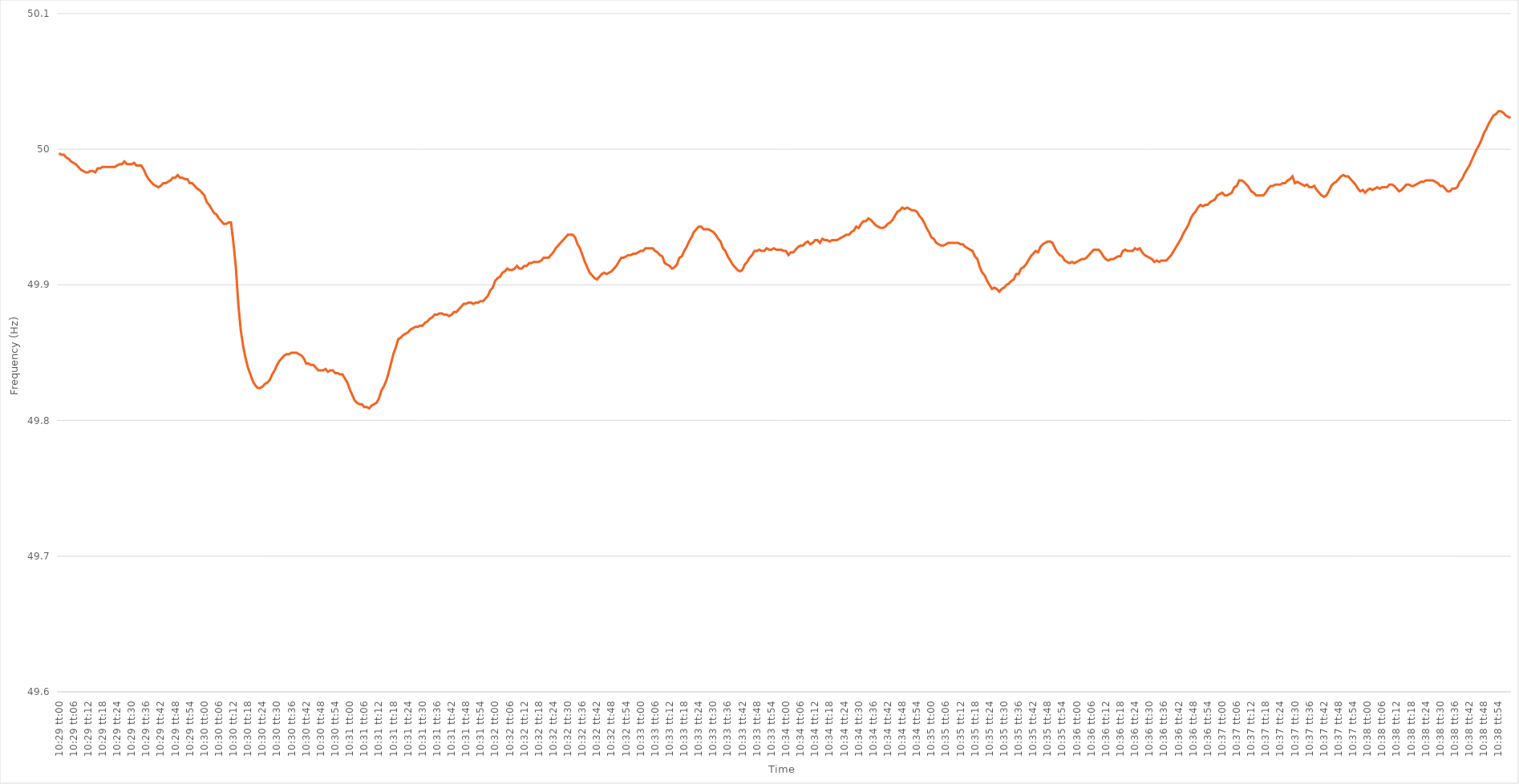
| Category | Series 0 |
|---|---|
| 0.4368055555555555 | 49.997 |
| 0.43681712962962965 | 49.996 |
| 0.4368287037037037 | 49.996 |
| 0.4368402777777778 | 49.994 |
| 0.4368518518518518 | 49.993 |
| 0.4368634259259259 | 49.991 |
| 0.43687499999999996 | 49.99 |
| 0.4368865740740741 | 49.989 |
| 0.43689814814814815 | 49.987 |
| 0.43690972222222224 | 49.985 |
| 0.4369212962962963 | 49.984 |
| 0.4369328703703704 | 49.983 |
| 0.4369444444444444 | 49.983 |
| 0.43695601851851856 | 49.984 |
| 0.4369675925925926 | 49.984 |
| 0.4369791666666667 | 49.983 |
| 0.43699074074074074 | 49.986 |
| 0.43700231481481483 | 49.986 |
| 0.43701388888888887 | 49.987 |
| 0.437025462962963 | 49.987 |
| 0.43703703703703706 | 49.987 |
| 0.4370486111111111 | 49.987 |
| 0.4370601851851852 | 49.987 |
| 0.43707175925925923 | 49.987 |
| 0.4370833333333333 | 49.988 |
| 0.43709490740740736 | 49.989 |
| 0.4371064814814815 | 49.989 |
| 0.43711805555555555 | 49.991 |
| 0.43712962962962965 | 49.989 |
| 0.4371412037037037 | 49.989 |
| 0.4371527777777778 | 49.989 |
| 0.4371643518518518 | 49.99 |
| 0.43717592592592597 | 49.988 |
| 0.4371875 | 49.988 |
| 0.4371990740740741 | 49.988 |
| 0.43721064814814814 | 49.985 |
| 0.43722222222222223 | 49.981 |
| 0.4372337962962963 | 49.978 |
| 0.4372453703703704 | 49.976 |
| 0.43725694444444446 | 49.974 |
| 0.4372685185185185 | 49.973 |
| 0.4372800925925926 | 49.972 |
| 0.43729166666666663 | 49.973 |
| 0.43730324074074073 | 49.975 |
| 0.43731481481481477 | 49.975 |
| 0.4373263888888889 | 49.976 |
| 0.43733796296296296 | 49.977 |
| 0.43734953703703705 | 49.979 |
| 0.4373611111111111 | 49.979 |
| 0.4373726851851852 | 49.981 |
| 0.4373842592592592 | 49.979 |
| 0.4373958333333334 | 49.979 |
| 0.4374074074074074 | 49.978 |
| 0.4374189814814815 | 49.978 |
| 0.43743055555555554 | 49.975 |
| 0.43744212962962964 | 49.975 |
| 0.4374537037037037 | 49.973 |
| 0.43746527777777783 | 49.971 |
| 0.43747685185185187 | 49.97 |
| 0.43748842592592596 | 49.968 |
| 0.4375 | 49.966 |
| 0.43751157407407404 | 49.961 |
| 0.43752314814814813 | 49.959 |
| 0.43753472222222217 | 49.956 |
| 0.4375462962962963 | 49.953 |
| 0.43755787037037036 | 49.952 |
| 0.43756944444444446 | 49.949 |
| 0.4375810185185185 | 49.947 |
| 0.4375925925925926 | 49.945 |
| 0.4376041666666666 | 49.945 |
| 0.4376157407407408 | 49.946 |
| 0.4376273148148148 | 49.946 |
| 0.4376388888888889 | 49.931 |
| 0.43765046296296295 | 49.913 |
| 0.43766203703703704 | 49.886 |
| 0.4376736111111111 | 49.867 |
| 0.43768518518518523 | 49.855 |
| 0.43769675925925927 | 49.846 |
| 0.43770833333333337 | 49.839 |
| 0.4377199074074074 | 49.834 |
| 0.4377314814814815 | 49.829 |
| 0.43774305555555554 | 49.826 |
| 0.4377546296296296 | 49.824 |
| 0.4377662037037037 | 49.824 |
| 0.43777777777777777 | 49.825 |
| 0.43778935185185186 | 49.827 |
| 0.4378009259259259 | 49.828 |
| 0.4378125 | 49.83 |
| 0.43782407407407403 | 49.834 |
| 0.4378356481481482 | 49.837 |
| 0.4378472222222222 | 49.841 |
| 0.4378587962962963 | 49.844 |
| 0.43787037037037035 | 49.846 |
| 0.43788194444444445 | 49.848 |
| 0.4378935185185185 | 49.849 |
| 0.43790509259259264 | 49.849 |
| 0.4379166666666667 | 49.85 |
| 0.43792824074074077 | 49.85 |
| 0.4379398148148148 | 49.85 |
| 0.4379513888888889 | 49.849 |
| 0.43796296296296294 | 49.848 |
| 0.437974537037037 | 49.846 |
| 0.43798611111111113 | 49.842 |
| 0.43799768518518517 | 49.842 |
| 0.43800925925925926 | 49.841 |
| 0.4380208333333333 | 49.841 |
| 0.4380324074074074 | 49.839 |
| 0.43804398148148144 | 49.837 |
| 0.4380555555555556 | 49.837 |
| 0.4380671296296296 | 49.837 |
| 0.4380787037037037 | 49.838 |
| 0.43809027777777776 | 49.836 |
| 0.43810185185185185 | 49.837 |
| 0.4381134259259259 | 49.837 |
| 0.43812500000000004 | 49.835 |
| 0.4381365740740741 | 49.835 |
| 0.4381481481481482 | 49.834 |
| 0.4381597222222222 | 49.834 |
| 0.4381712962962963 | 49.831 |
| 0.43818287037037035 | 49.828 |
| 0.4381944444444445 | 49.823 |
| 0.43820601851851854 | 49.819 |
| 0.43821759259259263 | 49.815 |
| 0.43822916666666667 | 49.813 |
| 0.4382407407407407 | 49.812 |
| 0.4382523148148148 | 49.812 |
| 0.43826388888888884 | 49.81 |
| 0.438275462962963 | 49.81 |
| 0.43828703703703703 | 49.809 |
| 0.4382986111111111 | 49.811 |
| 0.43831018518518516 | 49.812 |
| 0.43832175925925926 | 49.813 |
| 0.4383333333333333 | 49.816 |
| 0.43834490740740745 | 49.822 |
| 0.4383564814814815 | 49.825 |
| 0.4383680555555556 | 49.829 |
| 0.4383796296296296 | 49.835 |
| 0.4383912037037037 | 49.842 |
| 0.43840277777777775 | 49.849 |
| 0.4384143518518519 | 49.854 |
| 0.43842592592592594 | 49.86 |
| 0.43843750000000004 | 49.861 |
| 0.4384490740740741 | 49.863 |
| 0.4384606481481481 | 49.864 |
| 0.4384722222222222 | 49.865 |
| 0.43848379629629625 | 49.867 |
| 0.4384953703703704 | 49.868 |
| 0.43850694444444444 | 49.869 |
| 0.43851851851851853 | 49.869 |
| 0.43853009259259257 | 49.87 |
| 0.43854166666666666 | 49.87 |
| 0.4385532407407407 | 49.872 |
| 0.43856481481481485 | 49.873 |
| 0.4385763888888889 | 49.875 |
| 0.438587962962963 | 49.876 |
| 0.438599537037037 | 49.878 |
| 0.4386111111111111 | 49.878 |
| 0.43862268518518516 | 49.879 |
| 0.4386342592592593 | 49.879 |
| 0.43864583333333335 | 49.878 |
| 0.43865740740740744 | 49.878 |
| 0.4386689814814815 | 49.877 |
| 0.4386805555555555 | 49.878 |
| 0.4386921296296296 | 49.88 |
| 0.43870370370370365 | 49.88 |
| 0.4387152777777778 | 49.882 |
| 0.43872685185185184 | 49.884 |
| 0.43873842592592593 | 49.886 |
| 0.43875 | 49.886 |
| 0.43876157407407407 | 49.887 |
| 0.4387731481481481 | 49.887 |
| 0.43878472222222226 | 49.886 |
| 0.4387962962962963 | 49.887 |
| 0.4388078703703704 | 49.887 |
| 0.43881944444444443 | 49.888 |
| 0.4388310185185185 | 49.888 |
| 0.43884259259259256 | 49.89 |
| 0.4388541666666667 | 49.892 |
| 0.43886574074074075 | 49.896 |
| 0.43887731481481485 | 49.898 |
| 0.4388888888888889 | 49.903 |
| 0.438900462962963 | 49.905 |
| 0.438912037037037 | 49.906 |
| 0.43892361111111106 | 49.909 |
| 0.4389351851851852 | 49.91 |
| 0.43894675925925924 | 49.912 |
| 0.43895833333333334 | 49.911 |
| 0.4389699074074074 | 49.911 |
| 0.4389814814814815 | 49.912 |
| 0.4389930555555555 | 49.914 |
| 0.43900462962962966 | 49.912 |
| 0.4390162037037037 | 49.912 |
| 0.4390277777777778 | 49.914 |
| 0.43903935185185183 | 49.914 |
| 0.43905092592592593 | 49.916 |
| 0.43906249999999997 | 49.916 |
| 0.4390740740740741 | 49.917 |
| 0.43908564814814816 | 49.917 |
| 0.43909722222222225 | 49.917 |
| 0.4391087962962963 | 49.918 |
| 0.4391203703703704 | 49.92 |
| 0.4391319444444444 | 49.92 |
| 0.43914351851851857 | 49.92 |
| 0.4391550925925926 | 49.922 |
| 0.43916666666666665 | 49.924 |
| 0.43917824074074074 | 49.927 |
| 0.4391898148148148 | 49.929 |
| 0.4392013888888889 | 49.931 |
| 0.4392129629629629 | 49.933 |
| 0.43922453703703707 | 49.935 |
| 0.4392361111111111 | 49.937 |
| 0.4392476851851852 | 49.937 |
| 0.43925925925925924 | 49.937 |
| 0.43927083333333333 | 49.935 |
| 0.43928240740740737 | 49.93 |
| 0.4392939814814815 | 49.927 |
| 0.43930555555555556 | 49.922 |
| 0.43931712962962965 | 49.917 |
| 0.4393287037037037 | 49.913 |
| 0.4393402777777778 | 49.909 |
| 0.4393518518518518 | 49.907 |
| 0.439363425925926 | 49.905 |
| 0.439375 | 49.904 |
| 0.4393865740740741 | 49.906 |
| 0.43939814814814815 | 49.908 |
| 0.4394097222222222 | 49.909 |
| 0.4394212962962963 | 49.908 |
| 0.4394328703703703 | 49.909 |
| 0.43944444444444447 | 49.91 |
| 0.4394560185185185 | 49.912 |
| 0.4394675925925926 | 49.914 |
| 0.43947916666666664 | 49.917 |
| 0.43949074074074074 | 49.92 |
| 0.4395023148148148 | 49.92 |
| 0.4395138888888889 | 49.921 |
| 0.43952546296296297 | 49.922 |
| 0.43953703703703706 | 49.922 |
| 0.4395486111111111 | 49.923 |
| 0.4395601851851852 | 49.923 |
| 0.43957175925925923 | 49.924 |
| 0.4395833333333334 | 49.925 |
| 0.4395949074074074 | 49.925 |
| 0.4396064814814815 | 49.927 |
| 0.43961805555555555 | 49.927 |
| 0.43962962962962965 | 49.927 |
| 0.4396412037037037 | 49.927 |
| 0.4396527777777777 | 49.925 |
| 0.4396643518518519 | 49.924 |
| 0.4396759259259259 | 49.922 |
| 0.4396875 | 49.921 |
| 0.43969907407407405 | 49.916 |
| 0.43971064814814814 | 49.915 |
| 0.4397222222222222 | 49.914 |
| 0.43973379629629633 | 49.912 |
| 0.43974537037037037 | 49.913 |
| 0.43975694444444446 | 49.915 |
| 0.4397685185185185 | 49.92 |
| 0.4397800925925926 | 49.921 |
| 0.43979166666666664 | 49.925 |
| 0.4398032407407408 | 49.928 |
| 0.4398148148148148 | 49.932 |
| 0.4398263888888889 | 49.935 |
| 0.43983796296296296 | 49.939 |
| 0.43984953703703705 | 49.941 |
| 0.4398611111111111 | 49.943 |
| 0.43987268518518513 | 49.943 |
| 0.4398842592592593 | 49.941 |
| 0.4398958333333333 | 49.941 |
| 0.4399074074074074 | 49.941 |
| 0.43991898148148145 | 49.94 |
| 0.43993055555555555 | 49.939 |
| 0.4399421296296296 | 49.937 |
| 0.43995370370370374 | 49.934 |
| 0.4399652777777778 | 49.932 |
| 0.43997685185185187 | 49.927 |
| 0.4399884259259259 | 49.925 |
| 0.44 | 49.921 |
| 0.44001157407407404 | 49.918 |
| 0.4400231481481482 | 49.915 |
| 0.44003472222222223 | 49.913 |
| 0.4400462962962963 | 49.911 |
| 0.44005787037037036 | 49.91 |
| 0.44006944444444446 | 49.911 |
| 0.4400810185185185 | 49.915 |
| 0.44009259259259265 | 49.917 |
| 0.4401041666666667 | 49.92 |
| 0.4401157407407407 | 49.922 |
| 0.4401273148148148 | 49.925 |
| 0.44013888888888886 | 49.925 |
| 0.44015046296296295 | 49.926 |
| 0.440162037037037 | 49.925 |
| 0.44017361111111114 | 49.925 |
| 0.4401851851851852 | 49.927 |
| 0.4401967592592593 | 49.926 |
| 0.4402083333333333 | 49.926 |
| 0.4402199074074074 | 49.927 |
| 0.44023148148148145 | 49.926 |
| 0.4402430555555556 | 49.926 |
| 0.44025462962962963 | 49.926 |
| 0.44026620370370373 | 49.925 |
| 0.44027777777777777 | 49.925 |
| 0.44028935185185186 | 49.922 |
| 0.4403009259259259 | 49.924 |
| 0.44031250000000005 | 49.924 |
| 0.4403240740740741 | 49.926 |
| 0.4403356481481482 | 49.928 |
| 0.4403472222222222 | 49.929 |
| 0.44035879629629626 | 49.929 |
| 0.44037037037037036 | 49.931 |
| 0.4403819444444444 | 49.932 |
| 0.44039351851851855 | 49.93 |
| 0.4404050925925926 | 49.931 |
| 0.4404166666666667 | 49.933 |
| 0.4404282407407407 | 49.933 |
| 0.4404398148148148 | 49.931 |
| 0.44045138888888885 | 49.934 |
| 0.440462962962963 | 49.933 |
| 0.44047453703703704 | 49.933 |
| 0.44048611111111113 | 49.932 |
| 0.4404976851851852 | 49.933 |
| 0.44050925925925927 | 49.933 |
| 0.4405208333333333 | 49.933 |
| 0.44053240740740746 | 49.934 |
| 0.4405439814814815 | 49.935 |
| 0.4405555555555556 | 49.936 |
| 0.44056712962962963 | 49.937 |
| 0.44057870370370367 | 49.937 |
| 0.44059027777777776 | 49.939 |
| 0.4406018518518518 | 49.94 |
| 0.44061342592592595 | 49.943 |
| 0.440625 | 49.942 |
| 0.4406365740740741 | 49.945 |
| 0.4406481481481481 | 49.947 |
| 0.4406597222222222 | 49.947 |
| 0.44067129629629626 | 49.949 |
| 0.4406828703703704 | 49.948 |
| 0.44069444444444444 | 49.946 |
| 0.44070601851851854 | 49.944 |
| 0.4407175925925926 | 49.943 |
| 0.44072916666666667 | 49.942 |
| 0.4407407407407407 | 49.942 |
| 0.44075231481481486 | 49.943 |
| 0.4407638888888889 | 49.945 |
| 0.440775462962963 | 49.946 |
| 0.44078703703703703 | 49.948 |
| 0.4407986111111111 | 49.951 |
| 0.44081018518518517 | 49.954 |
| 0.4408217592592592 | 49.955 |
| 0.44083333333333335 | 49.957 |
| 0.4408449074074074 | 49.956 |
| 0.4408564814814815 | 49.957 |
| 0.4408680555555555 | 49.956 |
| 0.4408796296296296 | 49.955 |
| 0.44089120370370366 | 49.955 |
| 0.4409027777777778 | 49.954 |
| 0.44091435185185185 | 49.951 |
| 0.44092592592592594 | 49.949 |
| 0.4409375 | 49.946 |
| 0.4409490740740741 | 49.942 |
| 0.4409606481481481 | 49.939 |
| 0.44097222222222227 | 49.935 |
| 0.4409837962962963 | 49.934 |
| 0.4409953703703704 | 49.931 |
| 0.44100694444444444 | 49.93 |
| 0.44101851851851853 | 49.929 |
| 0.44103009259259257 | 49.929 |
| 0.4410416666666667 | 49.93 |
| 0.44105324074074076 | 49.931 |
| 0.4410648148148148 | 49.931 |
| 0.4410763888888889 | 49.931 |
| 0.44108796296296293 | 49.931 |
| 0.441099537037037 | 49.931 |
| 0.44111111111111106 | 49.93 |
| 0.4411226851851852 | 49.93 |
| 0.44113425925925925 | 49.928 |
| 0.44114583333333335 | 49.927 |
| 0.4411574074074074 | 49.926 |
| 0.4411689814814815 | 49.925 |
| 0.4411805555555555 | 49.921 |
| 0.44119212962962967 | 49.919 |
| 0.4412037037037037 | 49.913 |
| 0.4412152777777778 | 49.909 |
| 0.44122685185185184 | 49.907 |
| 0.44123842592592594 | 49.903 |
| 0.44125 | 49.9 |
| 0.4412615740740741 | 49.897 |
| 0.44127314814814816 | 49.898 |
| 0.44128472222222226 | 49.897 |
| 0.4412962962962963 | 49.895 |
| 0.44130787037037034 | 49.897 |
| 0.44131944444444443 | 49.898 |
| 0.44133101851851847 | 49.9 |
| 0.4413425925925926 | 49.901 |
| 0.44135416666666666 | 49.903 |
| 0.44136574074074075 | 49.904 |
| 0.4413773148148148 | 49.908 |
| 0.4413888888888889 | 49.908 |
| 0.4414004629629629 | 49.912 |
| 0.4414120370370371 | 49.913 |
| 0.4414236111111111 | 49.915 |
| 0.4414351851851852 | 49.918 |
| 0.44144675925925925 | 49.921 |
| 0.44145833333333334 | 49.923 |
| 0.4414699074074074 | 49.925 |
| 0.44148148148148153 | 49.924 |
| 0.44149305555555557 | 49.928 |
| 0.44150462962962966 | 49.93 |
| 0.4415162037037037 | 49.931 |
| 0.44152777777777774 | 49.932 |
| 0.44153935185185184 | 49.932 |
| 0.4415509259259259 | 49.931 |
| 0.4415625 | 49.927 |
| 0.44157407407407406 | 49.924 |
| 0.44158564814814816 | 49.922 |
| 0.4415972222222222 | 49.921 |
| 0.4416087962962963 | 49.918 |
| 0.44162037037037033 | 49.917 |
| 0.4416319444444445 | 49.916 |
| 0.4416435185185185 | 49.917 |
| 0.4416550925925926 | 49.916 |
| 0.44166666666666665 | 49.917 |
| 0.44167824074074075 | 49.918 |
| 0.4416898148148148 | 49.919 |
| 0.44170138888888894 | 49.919 |
| 0.441712962962963 | 49.92 |
| 0.44172453703703707 | 49.922 |
| 0.4417361111111111 | 49.924 |
| 0.4417476851851852 | 49.926 |
| 0.44175925925925924 | 49.926 |
| 0.4417708333333333 | 49.926 |
| 0.44178240740740743 | 49.924 |
| 0.44179398148148147 | 49.921 |
| 0.44180555555555556 | 49.919 |
| 0.4418171296296296 | 49.918 |
| 0.4418287037037037 | 49.919 |
| 0.44184027777777773 | 49.919 |
| 0.4418518518518519 | 49.92 |
| 0.4418634259259259 | 49.921 |
| 0.441875 | 49.921 |
| 0.44188657407407406 | 49.925 |
| 0.44189814814814815 | 49.926 |
| 0.4419097222222222 | 49.925 |
| 0.44192129629629634 | 49.925 |
| 0.4419328703703704 | 49.925 |
| 0.4419444444444445 | 49.927 |
| 0.4419560185185185 | 49.926 |
| 0.4419675925925926 | 49.927 |
| 0.44197916666666665 | 49.924 |
| 0.4419907407407408 | 49.922 |
| 0.44200231481481483 | 49.921 |
| 0.4420138888888889 | 49.92 |
| 0.44202546296296297 | 49.919 |
| 0.442037037037037 | 49.917 |
| 0.4420486111111111 | 49.918 |
| 0.44206018518518514 | 49.917 |
| 0.4420717592592593 | 49.918 |
| 0.44208333333333333 | 49.918 |
| 0.4420949074074074 | 49.918 |
| 0.44210648148148146 | 49.92 |
| 0.44211805555555556 | 49.922 |
| 0.4421296296296296 | 49.925 |
| 0.44214120370370374 | 49.928 |
| 0.4421527777777778 | 49.931 |
| 0.4421643518518519 | 49.934 |
| 0.4421759259259259 | 49.938 |
| 0.4421875 | 49.941 |
| 0.44219907407407405 | 49.944 |
| 0.4422106481481482 | 49.949 |
| 0.44222222222222224 | 49.952 |
| 0.44223379629629633 | 49.954 |
| 0.44224537037037037 | 49.957 |
| 0.4422569444444444 | 49.959 |
| 0.4422685185185185 | 49.958 |
| 0.44228009259259254 | 49.959 |
| 0.4422916666666667 | 49.959 |
| 0.44230324074074073 | 49.961 |
| 0.4423148148148148 | 49.962 |
| 0.44232638888888887 | 49.963 |
| 0.44233796296296296 | 49.966 |
| 0.442349537037037 | 49.967 |
| 0.44236111111111115 | 49.968 |
| 0.4423726851851852 | 49.966 |
| 0.4423842592592593 | 49.966 |
| 0.4423958333333333 | 49.967 |
| 0.4424074074074074 | 49.968 |
| 0.44241898148148145 | 49.972 |
| 0.4424305555555556 | 49.973 |
| 0.44244212962962964 | 49.977 |
| 0.44245370370370374 | 49.977 |
| 0.4424652777777778 | 49.976 |
| 0.4424768518518518 | 49.974 |
| 0.4424884259259259 | 49.972 |
| 0.44249999999999995 | 49.969 |
| 0.4425115740740741 | 49.968 |
| 0.44252314814814814 | 49.966 |
| 0.44253472222222223 | 49.966 |
| 0.44254629629629627 | 49.966 |
| 0.44255787037037037 | 49.966 |
| 0.4425694444444444 | 49.968 |
| 0.44258101851851855 | 49.971 |
| 0.4425925925925926 | 49.973 |
| 0.4426041666666667 | 49.973 |
| 0.4426157407407407 | 49.974 |
| 0.4426273148148148 | 49.974 |
| 0.44263888888888886 | 49.974 |
| 0.442650462962963 | 49.975 |
| 0.44266203703703705 | 49.975 |
| 0.44267361111111114 | 49.977 |
| 0.4426851851851852 | 49.978 |
| 0.4426967592592593 | 49.98 |
| 0.4427083333333333 | 49.975 |
| 0.44271990740740735 | 49.976 |
| 0.4427314814814815 | 49.975 |
| 0.44274305555555554 | 49.974 |
| 0.44275462962962964 | 49.973 |
| 0.4427662037037037 | 49.974 |
| 0.44277777777777777 | 49.972 |
| 0.4427893518518518 | 49.972 |
| 0.44280092592592596 | 49.973 |
| 0.4428125 | 49.97 |
| 0.4428240740740741 | 49.968 |
| 0.44283564814814813 | 49.966 |
| 0.4428472222222222 | 49.965 |
| 0.44285879629629626 | 49.966 |
| 0.4428703703703704 | 49.969 |
| 0.44288194444444445 | 49.973 |
| 0.44289351851851855 | 49.975 |
| 0.4429050925925926 | 49.976 |
| 0.4429166666666667 | 49.978 |
| 0.4429282407407407 | 49.98 |
| 0.44293981481481487 | 49.981 |
| 0.4429513888888889 | 49.98 |
| 0.44296296296296295 | 49.98 |
| 0.44297453703703704 | 49.978 |
| 0.4429861111111111 | 49.976 |
| 0.4429976851851852 | 49.974 |
| 0.4430092592592592 | 49.971 |
| 0.44302083333333336 | 49.969 |
| 0.4430324074074074 | 49.97 |
| 0.4430439814814815 | 49.968 |
| 0.44305555555555554 | 49.97 |
| 0.44306712962962963 | 49.971 |
| 0.44307870370370367 | 49.97 |
| 0.4430902777777778 | 49.971 |
| 0.44310185185185186 | 49.972 |
| 0.44311342592592595 | 49.971 |
| 0.443125 | 49.972 |
| 0.4431365740740741 | 49.972 |
| 0.4431481481481481 | 49.972 |
| 0.4431597222222223 | 49.974 |
| 0.4431712962962963 | 49.974 |
| 0.44318287037037035 | 49.973 |
| 0.44319444444444445 | 49.971 |
| 0.4432060185185185 | 49.969 |
| 0.4432175925925926 | 49.97 |
| 0.4432291666666666 | 49.972 |
| 0.44324074074074077 | 49.974 |
| 0.4432523148148148 | 49.974 |
| 0.4432638888888889 | 49.973 |
| 0.44327546296296294 | 49.973 |
| 0.44328703703703703 | 49.974 |
| 0.4432986111111111 | 49.975 |
| 0.4433101851851852 | 49.976 |
| 0.44332175925925926 | 49.976 |
| 0.44333333333333336 | 49.977 |
| 0.4433449074074074 | 49.977 |
| 0.4433564814814815 | 49.977 |
| 0.44336805555555553 | 49.977 |
| 0.4433796296296297 | 49.976 |
| 0.4433912037037037 | 49.975 |
| 0.4434027777777778 | 49.973 |
| 0.44341435185185185 | 49.973 |
| 0.4434259259259259 | 49.971 |
| 0.4434375 | 49.969 |
| 0.443449074074074 | 49.969 |
| 0.4434606481481482 | 49.971 |
| 0.4434722222222222 | 49.971 |
| 0.4434837962962963 | 49.972 |
| 0.44349537037037035 | 49.976 |
| 0.44350694444444444 | 49.978 |
| 0.4435185185185185 | 49.982 |
| 0.44353009259259263 | 49.985 |
| 0.44354166666666667 | 49.988 |
| 0.44355324074074076 | 49.992 |
| 0.4435648148148148 | 49.996 |
| 0.4435763888888889 | 50 |
| 0.44358796296296293 | 50.003 |
| 0.4435995370370371 | 50.007 |
| 0.4436111111111111 | 50.012 |
| 0.4436226851851852 | 50.015 |
| 0.44363425925925926 | 50.019 |
| 0.44364583333333335 | 50.022 |
| 0.4436574074074074 | 50.025 |
| 0.44366898148148143 | 50.026 |
| 0.4436805555555556 | 50.028 |
| 0.4436921296296296 | 50.028 |
| 0.4437037037037037 | 50.027 |
| 0.44371527777777775 | 50.025 |
| 0.44372685185185184 | 50.024 |
| 0.4437384259259259 | 50.023 |